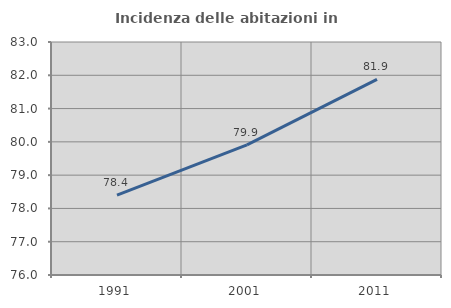
| Category | Incidenza delle abitazioni in proprietà  |
|---|---|
| 1991.0 | 78.399 |
| 2001.0 | 79.911 |
| 2011.0 | 81.875 |